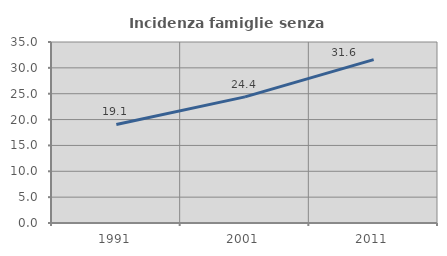
| Category | Incidenza famiglie senza nuclei |
|---|---|
| 1991.0 | 19.052 |
| 2001.0 | 24.394 |
| 2011.0 | 31.587 |